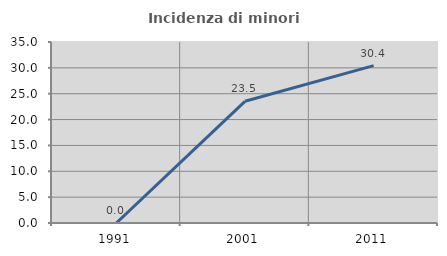
| Category | Incidenza di minori stranieri |
|---|---|
| 1991.0 | 0 |
| 2001.0 | 23.529 |
| 2011.0 | 30.435 |